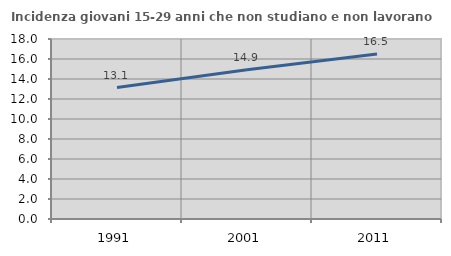
| Category | Incidenza giovani 15-29 anni che non studiano e non lavorano  |
|---|---|
| 1991.0 | 13.149 |
| 2001.0 | 14.915 |
| 2011.0 | 16.497 |